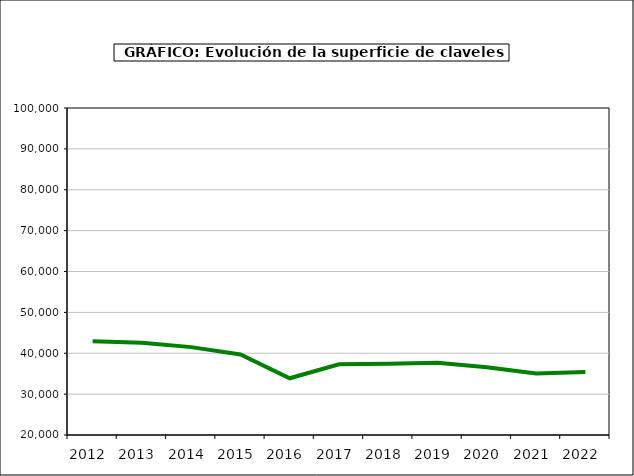
| Category | superficie |
|---|---|
| 2012.0 | 42920 |
| 2013.0 | 42572 |
| 2014.0 | 41501 |
| 2015.0 | 39713 |
| 2016.0 | 33880 |
| 2017.0 | 37286 |
| 2018.0 | 37444 |
| 2019.0 | 37654 |
| 2020.0 | 36554 |
| 2021.0 | 35061 |
| 2022.0 | 35420 |